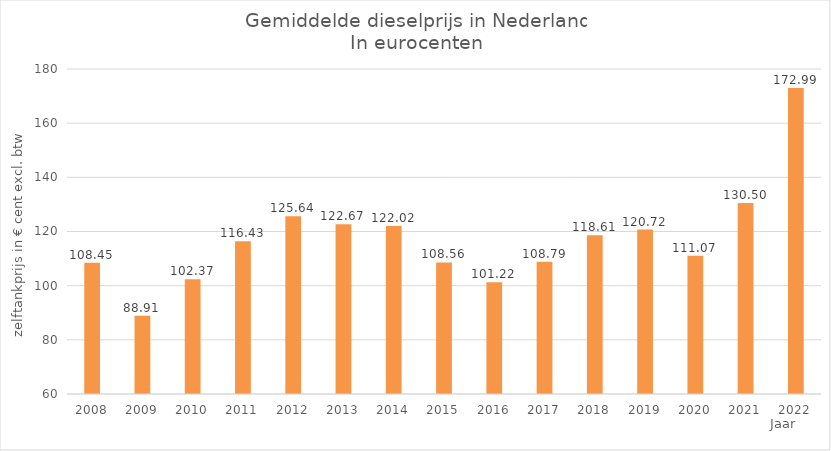
| Category | 2008 |
|---|---|
| 2008.0 | 108.446 |
| 2009.0 | 88.912 |
| 2010.0 | 102.373 |
| 2011.0 | 116.434 |
| 2012.0 | 125.64 |
| 2013.0 | 122.67 |
| 2014.0 | 122.019 |
| 2015.0 | 108.56 |
| 2016.0 | 101.22 |
| 2017.0 | 108.79 |
| 2018.0 | 118.61 |
| 2019.0 | 120.72 |
| 2020.0 | 111.07 |
| 2021.0 | 130.5 |
| 2022.0 | 172.988 |